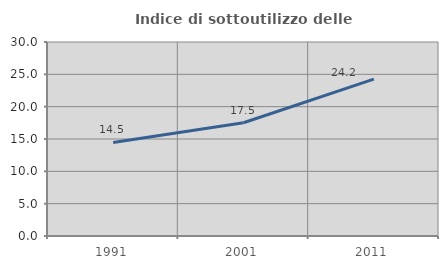
| Category | Indice di sottoutilizzo delle abitazioni  |
|---|---|
| 1991.0 | 14.472 |
| 2001.0 | 17.517 |
| 2011.0 | 24.249 |